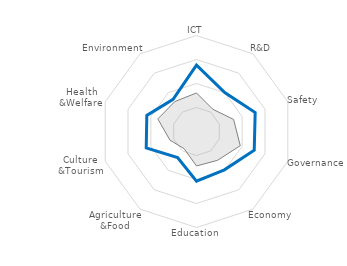
| Category | United States | OECD avg. |
|---|---|---|
| ICT | 0.691 | 0.402 |
| R&D | 0.501 | 0.287 |
| Safety | 0.643 | 0.407 |
| Governance | 0.632 | 0.479 |
| Economy | 0.494 | 0.371 |
| Education | 0.518 | 0.359 |
| Agriculture
&Food | 0.335 | 0.22 |
| Culture
&Tourism | 0.551 | 0.291 |
| Health
&Welfare | 0.544 | 0.424 |
| Environment | 0.415 | 0.385 |